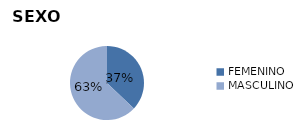
| Category | Series 0 |
|---|---|
| FEMENINO | 1034 |
| MASCULINO | 1758 |